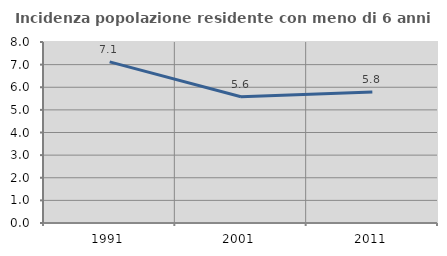
| Category | Incidenza popolazione residente con meno di 6 anni |
|---|---|
| 1991.0 | 7.122 |
| 2001.0 | 5.581 |
| 2011.0 | 5.792 |